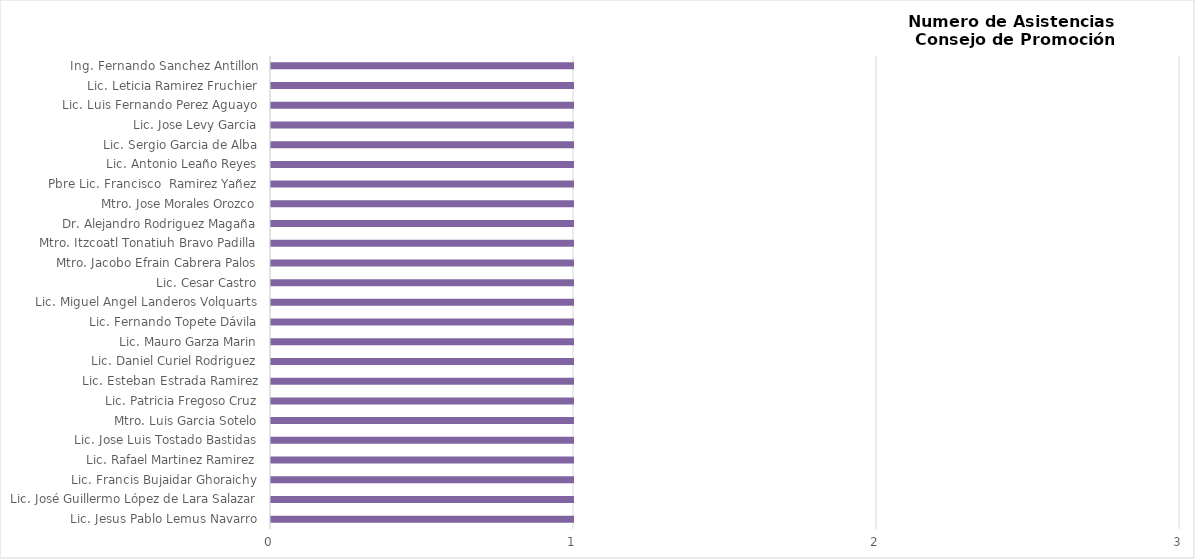
| Category | Series 0 |
|---|---|
| Lic. Jesus Pablo Lemus Navarro | 1 |
| Lic. José Guillermo López de Lara Salazar | 1 |
| Lic. Francis Bujaidar Ghoraichy | 1 |
| Lic. Rafael Martinez Ramirez | 1 |
| Lic. Jose Luis Tostado Bastidas | 1 |
| Mtro. Luis Garcia Sotelo | 1 |
| Lic. Patricia Fregoso Cruz | 1 |
| Lic. Esteban Estrada Ramirez | 1 |
| Lic. Daniel Curiel Rodriguez | 1 |
| Lic. Mauro Garza Marin | 1 |
| Lic. Fernando Topete Dávila | 1 |
| Lic. Miguel Angel Landeros Volquarts | 1 |
| Lic. Cesar Castro | 1 |
| Mtro. Jacobo Efrain Cabrera Palos | 1 |
| Mtro. Itzcoatl Tonatiuh Bravo Padilla | 1 |
| Dr. Alejandro Rodriguez Magaña | 1 |
| Mtro. Jose Morales Orozco | 1 |
| Pbre Lic. Francisco  Ramirez Yañez | 1 |
| Lic. Antonio Leaño Reyes | 1 |
| Lic. Sergio Garcia de Alba | 1 |
| Lic. Jose Levy Garcia | 1 |
| Lic. Luis Fernando Perez Aguayo | 1 |
| Lic. Leticia Ramirez Fruchier | 1 |
| Ing. Fernando Sanchez Antillon | 1 |